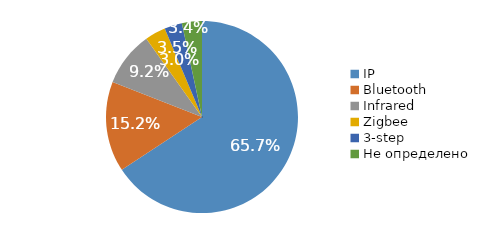
| Category | Series 0 |
|---|---|
| IP | 0.657 |
| Bluetooth | 0.152 |
| Infrared | 0.092 |
| Zigbee | 0.035 |
| 3-step | 0.03 |
| Не определено | 0.034 |